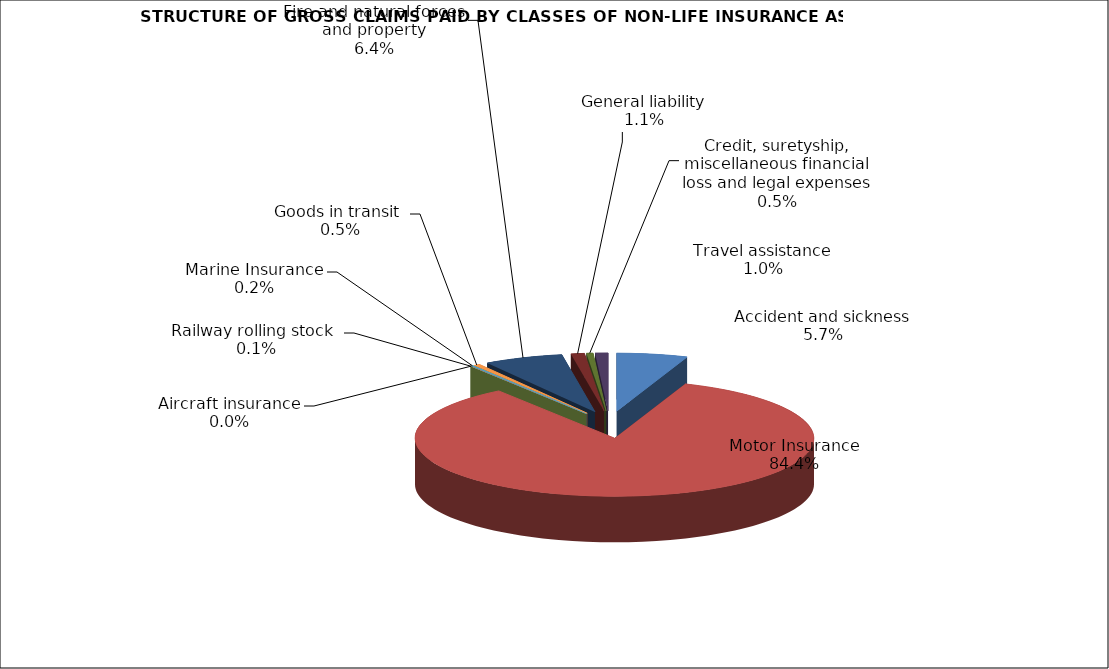
| Category | Accident and sickness |
|---|---|
| Accident and sickness | 0.057 |
| Motor Insurance | 0.844 |
| Railway rolling stock  | 0.001 |
| Aircraft insurance | 0 |
| Marine Insurance | 0.002 |
| Goods in transit  | 0.005 |
| Fire and natural forces and property | 0.064 |
| General liability | 0.011 |
| Credit, suretyship, miscellaneous financial loss and legal expenses | 0.005 |
| Travel assistance | 0.01 |